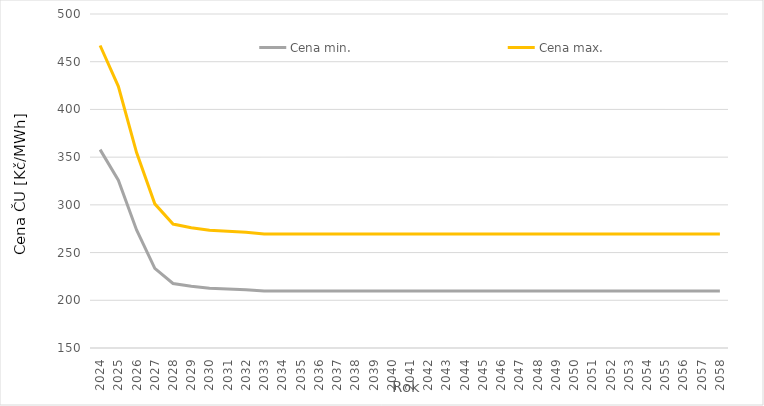
| Category | Cena min. | Cena max. |
|---|---|---|
| 2024.0 | 357.894 | 466.992 |
| 2025.0 | 325.833 | 424.244 |
| 2026.0 | 273.74 | 354.786 |
| 2027.0 | 233.444 | 301.059 |
| 2028.0 | 217.563 | 279.884 |
| 2029.0 | 214.668 | 276.025 |
| 2030.0 | 212.61 | 273.281 |
| 2031.0 | 211.929 | 272.372 |
| 2032.0 | 211.163 | 271.351 |
| 2033.0 | 209.78 | 269.506 |
| 2034.0 | 209.78 | 269.506 |
| 2035.0 | 209.78 | 269.506 |
| 2036.0 | 209.78 | 269.506 |
| 2037.0 | 209.78 | 269.506 |
| 2038.0 | 209.78 | 269.506 |
| 2039.0 | 209.78 | 269.506 |
| 2040.0 | 209.78 | 269.506 |
| 2041.0 | 209.78 | 269.506 |
| 2042.0 | 209.78 | 269.506 |
| 2043.0 | 209.78 | 269.506 |
| 2044.0 | 209.78 | 269.506 |
| 2045.0 | 209.78 | 269.506 |
| 2046.0 | 209.78 | 269.506 |
| 2047.0 | 209.78 | 269.506 |
| 2048.0 | 209.78 | 269.506 |
| 2049.0 | 209.78 | 269.506 |
| 2050.0 | 209.78 | 269.506 |
| 2051.0 | 209.78 | 269.506 |
| 2052.0 | 209.78 | 269.506 |
| 2053.0 | 209.78 | 269.506 |
| 2054.0 | 209.78 | 269.506 |
| 2055.0 | 209.78 | 269.506 |
| 2056.0 | 209.78 | 269.506 |
| 2057.0 | 209.78 | 269.506 |
| 2058.0 | 209.78 | 269.506 |